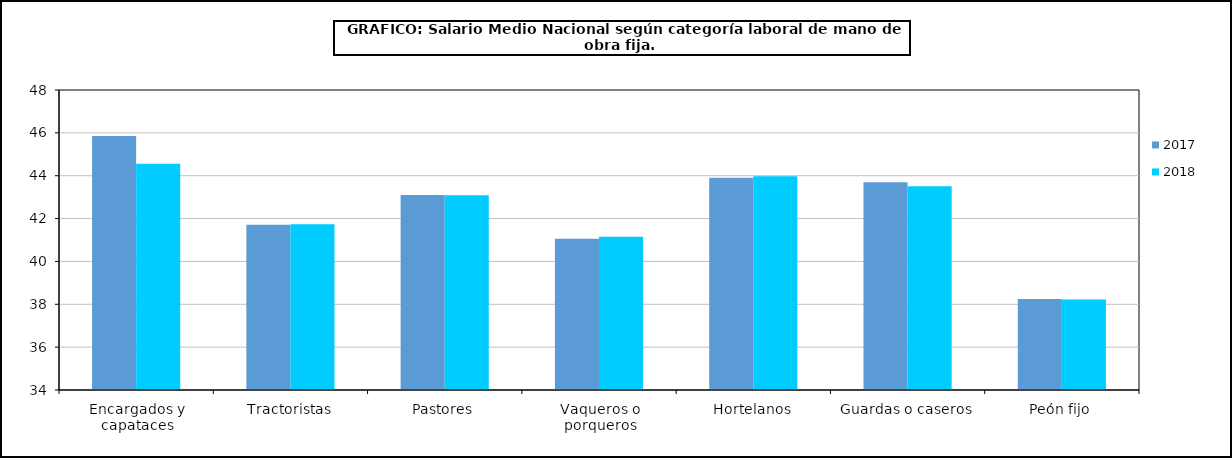
| Category | 2017 | 2018 |
|---|---|---|
| 0 | 45.85 | 44.56 |
| 1 | 41.71 | 41.73 |
| 2 | 43.1 | 43.09 |
| 3 | 41.06 | 41.15 |
| 4 | 43.9 | 43.98 |
| 5 | 43.69 | 43.51 |
| 6 | 38.25 | 38.22 |